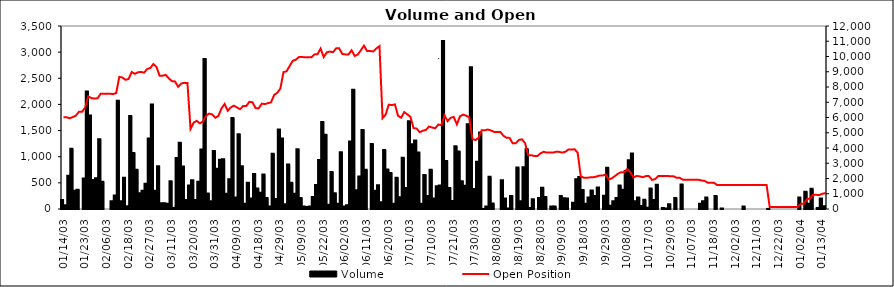
| Category | Volume  |
|---|---|
| 2003-01-14 | 170 |
| 2003-01-15 | 70 |
| 2003-01-16 | 635 |
| 2003-01-17 | 1150 |
| 2003-01-20 | 350 |
| 2003-01-21 | 370 |
| 2003-01-22 | 0 |
| 2003-01-23 | 585 |
| 2003-01-24 | 2245 |
| 2003-01-27 | 1790 |
| 2003-01-28 | 555 |
| 2003-01-29 | 590 |
| 2003-01-30 | 1332 |
| 2003-02-05 | 520 |
| 2003-02-06 | 0 |
| 2003-02-07 | 0 |
| 2003-02-10 | 150 |
| 2003-02-11 | 260 |
| 2003-02-13 | 2070 |
| 2003-02-14 | 150 |
| 2003-02-17 | 600 |
| 2003-02-18 | 52 |
| 2003-02-19 | 1780 |
| 2003-02-20 | 1070 |
| 2003-02-21 | 750 |
| 2003-02-24 | 300 |
| 2003-02-25 | 350 |
| 2003-02-26 | 485 |
| 2003-02-27 | 1350 |
| 2003-02-28 | 2000 |
| 2003-03-03 | 350 |
| 2003-03-05 | 820 |
| 2003-03-06 | 110 |
| 2003-03-07 | 110 |
| 2003-03-10 | 100 |
| 2003-03-11 | 530 |
| 2003-03-12 | 22 |
| 2003-03-13 | 974 |
| 2003-03-14 | 1267 |
| 2003-03-17 | 815 |
| 2003-03-18 | 170 |
| 2003-03-19 | 450 |
| 2003-03-20 | 550 |
| 2003-03-21 | 170 |
| 2003-03-24 | 520 |
| 2003-03-25 | 1140 |
| 2003-03-26 | 2870 |
| 2003-03-27 | 295 |
| 2003-03-28 | 150 |
| 2003-03-31 | 1110 |
| 2003-04-01 | 772 |
| 2003-04-02 | 940 |
| 2003-04-03 | 950 |
| 2003-04-04 | 290 |
| 2003-04-07 | 570 |
| 2003-04-08 | 1740 |
| 2003-04-09 | 220 |
| 2003-04-10 | 1430 |
| 2003-04-11 | 820 |
| 2003-04-14 | 100 |
| 2003-04-15 | 500 |
| 2003-04-16 | 200 |
| 2003-04-17 | 670 |
| 2003-04-18 | 390 |
| 2003-04-21 | 310 |
| 2003-04-22 | 660 |
| 2003-04-23 | 210 |
| 2003-04-24 | 50 |
| 2003-04-25 | 1055 |
| 2003-04-28 | 190 |
| 2003-04-29 | 1520 |
| 2003-04-30 | 1350 |
| 2003-05-02 | 90 |
| 2003-05-05 | 850 |
| 2003-05-06 | 500 |
| 2003-05-07 | 290 |
| 2003-05-08 | 1145 |
| 2003-05-09 | 210 |
| 2003-05-12 | 50 |
| 2003-05-13 | 40 |
| 2003-05-16 | 50 |
| 2003-05-19 | 230 |
| 2003-05-20 | 457 |
| 2003-05-21 | 938 |
| 2003-05-22 | 1665 |
| 2003-05-23 | 1421 |
| 2003-05-26 | 80 |
| 2003-05-27 | 710 |
| 2003-05-28 | 300 |
| 2003-05-29 | 100 |
| 2003-05-30 | 1085 |
| 2003-06-02 | 50 |
| 2003-06-03 | 70 |
| 2003-06-04 | 1290 |
| 2003-06-05 | 2280 |
| 2003-06-06 | 360 |
| 2003-06-09 | 621 |
| 2003-06-10 | 1510 |
| 2003-06-11 | 750 |
| 2003-06-12 | 0 |
| 2003-06-13 | 1245 |
| 2003-06-16 | 350 |
| 2003-06-17 | 455 |
| 2003-06-18 | 130 |
| 2003-06-19 | 1130 |
| 2003-06-20 | 754 |
| 2003-06-23 | 690 |
| 2003-06-24 | 100 |
| 2003-06-25 | 600 |
| 2003-06-26 | 225 |
| 2003-06-27 | 980 |
| 2003-06-30 | 400 |
| 2003-07-01 | 1680 |
| 2003-07-02 | 1240 |
| 2003-07-03 | 1310 |
| 2003-07-04 | 1080 |
| 2003-07-07 | 100 |
| 2003-07-08 | 650 |
| 2003-07-09 | 250 |
| 2003-07-10 | 750 |
| 2003-07-11 | 200 |
| 2003-07-14 | 435 |
| 2003-07-15 | 450 |
| 2003-07-16 | 3215 |
| 2003-07-17 | 920 |
| 2003-07-18 | 400 |
| 2003-07-21 | 155 |
| 2003-07-22 | 1201 |
| 2003-07-23 | 1100 |
| 2003-07-24 | 530 |
| 2003-07-25 | 445 |
| 2003-07-28 | 1623 |
| 2003-07-29 | 2712 |
| 2003-07-30 | 384 |
| 2003-07-31 | 905 |
| 2003-08-01 | 1462 |
| 2003-08-04 | 1 |
| 2003-08-05 | 50 |
| 2003-08-06 | 615 |
| 2003-08-07 | 105 |
| 2003-08-08 | 0 |
| 2003-08-11 | 0 |
| 2003-08-12 | 550 |
| 2003-08-13 | 200 |
| 2003-08-14 | 10 |
| 2003-08-15 | 250 |
| 2003-08-18 | 0 |
| 2003-08-19 | 795 |
| 2003-08-20 | 150 |
| 2003-08-21 | 800 |
| 2003-08-22 | 1141 |
| 2003-08-25 | 20 |
| 2003-08-26 | 186 |
| 2003-08-27 | 0 |
| 2003-08-28 | 209 |
| 2003-08-29 | 406 |
| 2003-09-02 | 230 |
| 2003-09-03 | 0 |
| 2003-09-04 | 50 |
| 2003-09-05 | 50 |
| 2003-09-08 | 0 |
| 2003-09-09 | 250 |
| 2003-09-10 | 205 |
| 2003-09-11 | 200 |
| 2003-09-12 | 0 |
| 2003-09-15 | 120 |
| 2003-09-16 | 570 |
| 2003-09-17 | 610 |
| 2003-09-18 | 365 |
| 2003-09-19 | 100 |
| 2003-09-22 | 220 |
| 2003-09-23 | 352 |
| 2003-09-24 | 250 |
| 2003-09-25 | 410 |
| 2003-09-26 | 0 |
| 2003-09-29 | 255 |
| 2003-09-30 | 790 |
| 2003-10-01 | 60 |
| 2003-10-02 | 150 |
| 2003-10-03 | 210 |
| 2003-10-06 | 450 |
| 2003-10-07 | 370 |
| 2003-10-08 | 727 |
| 2003-10-09 | 930 |
| 2003-10-10 | 1060 |
| 2003-10-13 | 150 |
| 2003-10-14 | 222 |
| 2003-10-15 | 55 |
| 2003-10-16 | 176 |
| 2003-10-17 | 25 |
| 2003-10-20 | 394 |
| 2003-10-21 | 170 |
| 2003-10-22 | 465 |
| 2003-10-23 | 0 |
| 2003-10-27 | 20 |
| 2003-10-28 | 10 |
| 2003-10-29 | 90 |
| 2003-10-30 | 0 |
| 2003-10-31 | 210 |
| 2003-11-03 | 0 |
| 2003-11-04 | 470 |
| 2003-11-05 | 0 |
| 2003-11-06 | 0 |
| 2003-11-07 | 0 |
| 2003-11-10 | 0 |
| 2003-11-11 | 0 |
| 2003-11-12 | 100 |
| 2003-11-13 | 150 |
| 2003-11-14 | 218 |
| 2003-11-17 | 0 |
| 2003-11-18 | 0 |
| 2003-11-19 | 250 |
| 2003-11-20 | 0 |
| 2003-11-21 | 10 |
| 2003-11-27 | 0 |
| 2003-11-28 | 0 |
| 2003-12-01 | 0 |
| 2003-12-02 | 0 |
| 2003-12-03 | 0 |
| 2003-12-04 | 0 |
| 2003-12-05 | 50 |
| 2003-12-08 | 0 |
| 2003-12-09 | 0 |
| 2003-12-10 | 0 |
| 2003-12-11 | 0 |
| 2003-12-12 | 0 |
| 2003-12-15 | 0 |
| 2003-12-16 | 0 |
| 2003-12-17 | 2 |
| 2003-12-18 | 0 |
| 2003-12-19 | 0 |
| 2003-12-22 | 0 |
| 2003-12-23 | 0 |
| 2003-12-24 | 0 |
| 2003-12-26 | 0 |
| 2003-12-29 | 0 |
| 2003-12-30 | 0 |
| 2003-12-31 | 0 |
| 2004-01-02 | 220 |
| 2004-01-05 | 0 |
| 2004-01-06 | 330 |
| 2004-01-07 | 101 |
| 2004-01-08 | 387 |
| 2004-01-09 | 0 |
| 2004-01-12 | 20 |
| 2004-01-13 | 200 |
| 2004-01-14 | 52 |